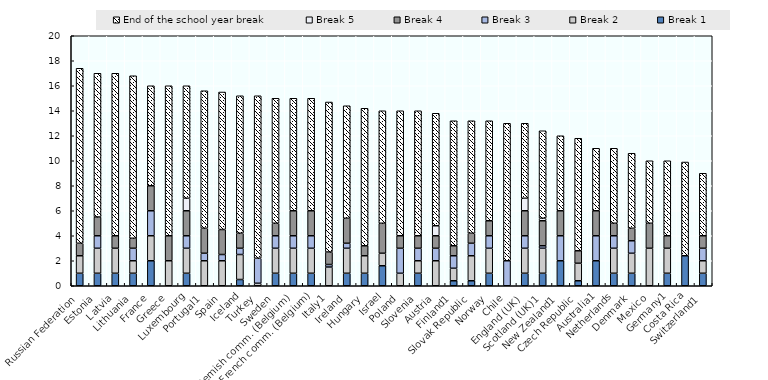
| Category | Break 1 | Break 2 | Break 3 | Break 4 | Break 5 | End of the school year break |
|---|---|---|---|---|---|---|
| Russian Federation | 1 | 1.4 | 0 | 1 | 0 | 14 |
| Estonia | 1 | 2 | 1 | 1.5 | 0 | 11.5 |
| Latvia | 1 | 2 | 0 | 1 | 0 | 13 |
| Lithuania | 1 | 1 | 1 | 0.8 | 0 | 13 |
| France | 2 | 2 | 2 | 2 | 0 | 8 |
| Greece | 0 | 2 | 0 | 2 | 0 | 12 |
| Luxembourg | 1 | 2 | 1 | 2 | 1 | 9 |
| Portugal1 | 0 | 2 | 0.6 | 2 | 0 | 11 |
| Spain | 0 | 2 | 0.5 | 2 | 0 | 11 |
| Iceland | 0.5 | 2 | 0.5 | 1.2 | 0 | 11 |
| Turkey | 0 | 0.2 | 2 | 0 | 0 | 13 |
| Sweden | 1 | 2 | 1 | 1 | 0 | 10 |
| Flemish comm. (Belgium) | 1 | 2 | 1 | 2 | 0 | 9 |
| French comm. (Belgium) | 1 | 2 | 1 | 2 | 0 | 9 |
| Italy1 | 0 | 1.5 | 0.2 | 1 | 0 | 12 |
| Ireland | 1 | 2 | 0.4 | 2 | 0 | 9 |
| Hungary | 1 | 1.4 | 0 | 0.8 | 0 | 11 |
| Israel | 1.6 | 1 | 0 | 2.4 | 0 | 9 |
| Poland | 0 | 1 | 2 | 1 | 0 | 10 |
| Slovenia | 1 | 1 | 1 | 1 | 0 | 10 |
| Austria | 0 | 2 | 1 | 1 | 0.8 | 9 |
| Finland1 | 0.4 | 1 | 1 | 0.8 | 0 | 10 |
| Slovak Republic | 0.4 | 2 | 1 | 0.8 | 0 | 9 |
| Norway | 1 | 2 | 1 | 1.2 | 0 | 8 |
| Chile | 0 | 0 | 2 | 0 | 0 | 11 |
| England (UK) | 1 | 2 | 1 | 2 | 1 | 6 |
| Scotland (UK)1 | 1 | 2 | 0.2 | 2 | 0.2 | 7 |
| New Zealand1 | 2 | 0 | 2 | 2 | 0 | 6 |
| Czech Republic | 0.4 | 1.4 | 0 | 1 | 0 | 9 |
| Australia1 | 2 | 0 | 2 | 2 | 0 | 5 |
| Netherlands | 1 | 2 | 1 | 1 | 0 | 6 |
| Denmark | 1 | 1.6 | 1 | 1 | 0 | 6 |
| Mexico | 0 | 3 | 0 | 2 | 0 | 5 |
| Germany1 | 1 | 2 | 0 | 1 | 0 | 6 |
| Costa Rica | 2.4 | 0 | 0 | 0 | 0 | 7.5 |
| Switzerland1 | 1 | 1 | 1 | 1 | 0 | 5 |